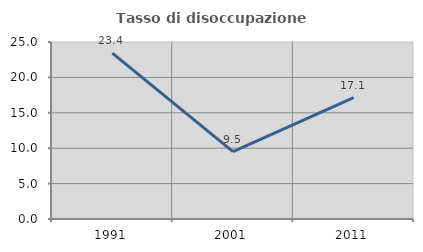
| Category | Tasso di disoccupazione giovanile  |
|---|---|
| 1991.0 | 23.438 |
| 2001.0 | 9.524 |
| 2011.0 | 17.143 |